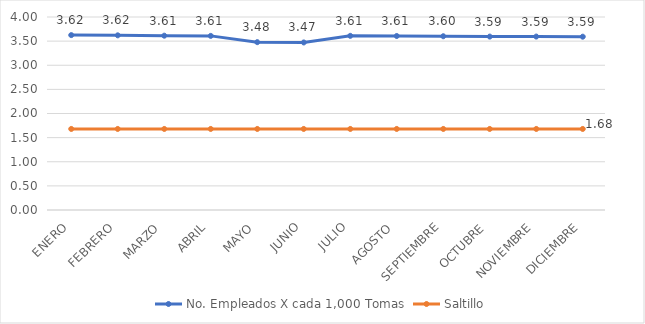
| Category | No. Empleados X cada 1,000 Tomas | Saltillo |
|---|---|---|
| ENERO | 3.625 | 1.68 |
| FEBRERO | 3.62 | 1.68 |
| MARZO | 3.613 | 1.68 |
| ABRIL | 3.609 | 1.68 |
| MAYO | 3.479 | 1.68 |
| JUNIO | 3.472 | 1.68 |
| JULIO | 3.61 | 1.68 |
| AGOSTO | 3.606 | 1.68 |
| SEPTIEMBRE | 3.601 | 1.68 |
| OCTUBRE | 3.594 | 1.68 |
| NOVIEMBRE | 3.595 | 1.68 |
| DICIEMBRE | 3.592 | 1.68 |